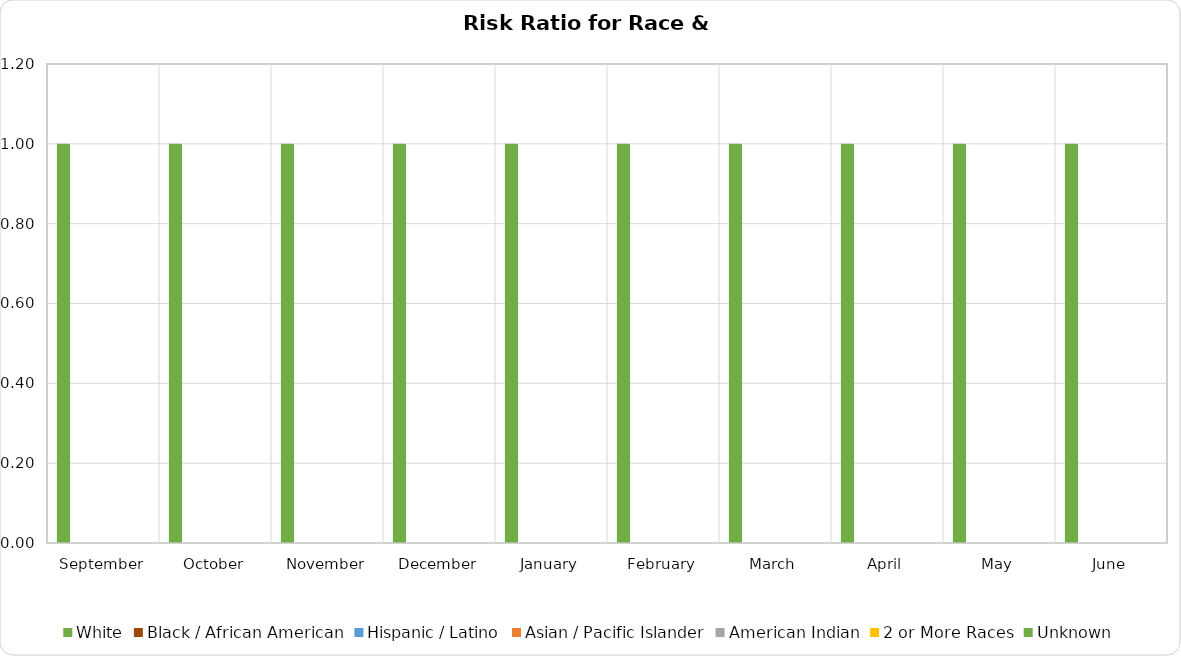
| Category | White | Black / African American | Hispanic / Latino | Asian / Pacific Islander | American Indian | 2 or More Races | Unknown |
|---|---|---|---|---|---|---|---|
| September | 1 | 0 | 0 | 0 | 0 | 0 | 0 |
| October | 1 | 0 | 0 | 0 | 0 | 0 | 0 |
| November | 1 | 0 | 0 | 0 | 0 | 0 | 0 |
| December | 1 | 0 | 0 | 0 | 0 | 0 | 0 |
| January | 1 | 0 | 0 | 0 | 0 | 0 | 0 |
| February | 1 | 0 | 0 | 0 | 0 | 0 | 0 |
| March | 1 | 0 | 0 | 0 | 0 | 0 | 0 |
| April | 1 | 0 | 0 | 0 | 0 | 0 | 0 |
| May | 1 | 0 | 0 | 0 | 0 | 0 | 0 |
| June | 1 | 0 | 0 | 0 | 0 | 0 | 0 |